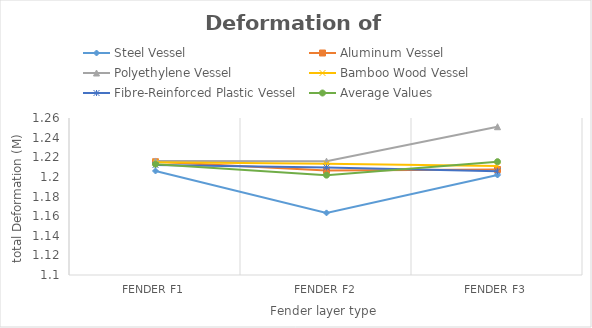
| Category | Steel Vessel | Aluminum Vessel | Polyethylene Vessel | Bamboo Wood Vessel | Fibre-Reinforced Plastic Vessel | Average Values |
|---|---|---|---|---|---|---|
| Fender F1 | 1.206 | 1.215 | 1.216 | 1.215 | 1.212 | 1.213 |
| Fender F2 | 1.163 | 1.207 | 1.216 | 1.213 | 1.21 | 1.202 |
| Fender F3 | 1.202 | 1.208 | 1.251 | 1.211 | 1.206 | 1.215 |